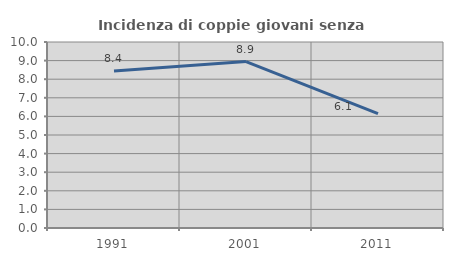
| Category | Incidenza di coppie giovani senza figli |
|---|---|
| 1991.0 | 8.444 |
| 2001.0 | 8.949 |
| 2011.0 | 6.149 |